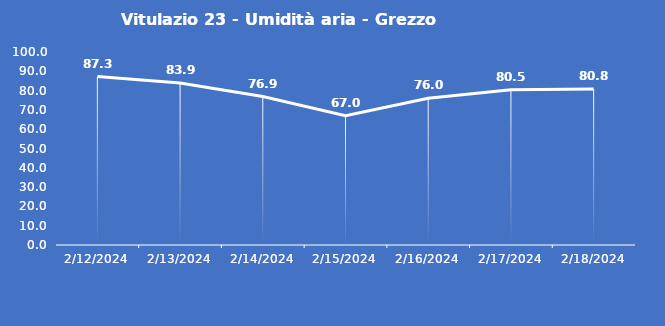
| Category | Vitulazio 23 - Umidità aria - Grezzo (%) |
|---|---|
| 2/12/24 | 87.3 |
| 2/13/24 | 83.9 |
| 2/14/24 | 76.9 |
| 2/15/24 | 67 |
| 2/16/24 | 76 |
| 2/17/24 | 80.5 |
| 2/18/24 | 80.8 |